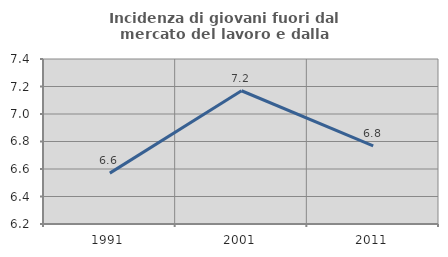
| Category | Incidenza di giovani fuori dal mercato del lavoro e dalla formazione  |
|---|---|
| 1991.0 | 6.57 |
| 2001.0 | 7.169 |
| 2011.0 | 6.769 |